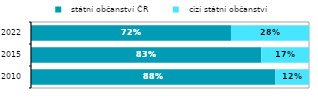
| Category |   státní občanství ČR |   cizí státní občanství |
|---|---|---|
| 2010.0 | 0.879 | 0.121 |
| 2015.0 | 0.828 | 0.172 |
| 2022.0 | 0.719 | 0.281 |